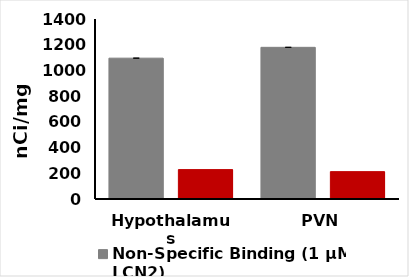
| Category | Non-Specific Binding (1 µM LCN2) | Specific Binding  |
|---|---|---|
| Hypothalamus | 1095.363 | 228.569 |
| PVN | 1179.59 | 212.803 |